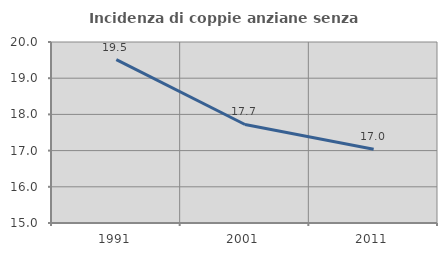
| Category | Incidenza di coppie anziane senza figli  |
|---|---|
| 1991.0 | 19.512 |
| 2001.0 | 17.722 |
| 2011.0 | 17.037 |